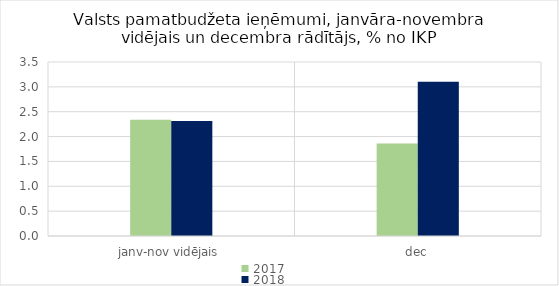
| Category | 2017 | 2018 |
|---|---|---|
| janv-nov vidējais | 2.336 | 2.314 |
| dec | 1.859 | 3.103 |